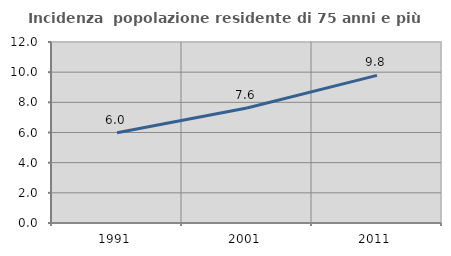
| Category | Incidenza  popolazione residente di 75 anni e più |
|---|---|
| 1991.0 | 5.987 |
| 2001.0 | 7.627 |
| 2011.0 | 9.785 |